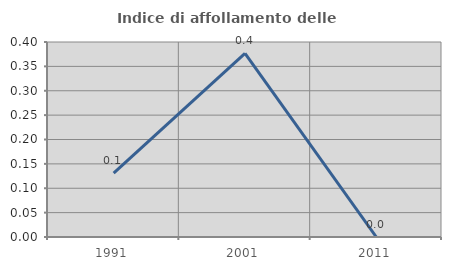
| Category | Indice di affollamento delle abitazioni  |
|---|---|
| 1991.0 | 0.131 |
| 2001.0 | 0.377 |
| 2011.0 | 0 |